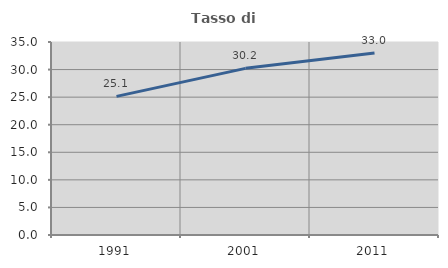
| Category | Tasso di occupazione   |
|---|---|
| 1991.0 | 25.134 |
| 2001.0 | 30.222 |
| 2011.0 | 32.991 |